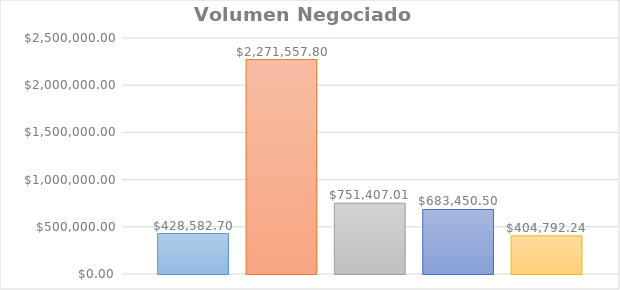
| Category | S18 | S19 | S20 | S21 | S22 |
|---|---|---|---|---|---|
| 0 | 428582.7 | 2271557.8 | 751407.01 | 683450.5 | 404792.24 |